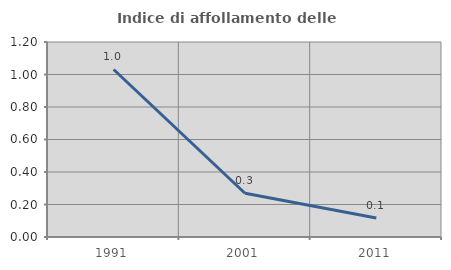
| Category | Indice di affollamento delle abitazioni  |
|---|---|
| 1991.0 | 1.031 |
| 2001.0 | 0.269 |
| 2011.0 | 0.116 |